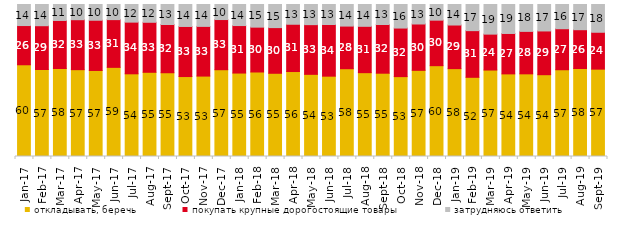
| Category | откладывать, беречь | покупать крупные дорогостоящие товары | затрудняюсь ответить |
|---|---|---|---|
| 2017-01-01 | 60.35 | 25.8 | 13.85 |
| 2017-02-01 | 56.8 | 28.6 | 13.85 |
| 2017-03-01 | 57.9 | 31.6 | 10.5 |
| 2017-04-01 | 57.1 | 32.85 | 10 |
| 2017-05-01 | 56.6 | 33.05 | 10.35 |
| 2017-06-01 | 58.65 | 31.4 | 9.95 |
| 2017-07-01 | 54.4 | 34 | 11.6 |
| 2017-08-01 | 55.4 | 32.9 | 11.7 |
| 2017-09-01 | 55.1 | 31.75 | 13.15 |
| 2017-10-01 | 52.6 | 32.95 | 14.45 |
| 2017-11-01 | 52.9 | 32.7 | 14.4 |
| 2017-12-01 | 57.1 | 33 | 9.9 |
| 2018-01-01 | 54.9 | 31.25 | 13.85 |
| 2018-02-01 | 55.6 | 29.5 | 14.9 |
| 2018-03-01 | 54.75 | 30.05 | 15.2 |
| 2018-04-01 | 55.9 | 31.1 | 13 |
| 2018-05-01 | 54.05 | 32.7 | 13.25 |
| 2018-06-01 | 52.85 | 34 | 13.15 |
| 2018-07-01 | 57.75 | 28.05 | 14.2 |
| 2018-08-01 | 55.15 | 30.5 | 14.35 |
| 2018-09-01 | 54.8 | 32.05 | 13.15 |
| 2018-10-01 | 52.55 | 31.95 | 15.5 |
| 2018-11-01 | 56.687 | 30.489 | 12.824 |
| 2018-12-01 | 59.75 | 29.95 | 10.3 |
| 2019-01-01 | 57.8 | 28.7 | 13.5 |
| 2019-02-01 | 52.1 | 30.7 | 17.2 |
| 2019-03-01 | 56.887 | 23.62 | 19.493 |
| 2019-04-01 | 54.356 | 26.584 | 19.059 |
| 2019-05-01 | 54.383 | 27.935 | 17.682 |
| 2019-06-01 | 53.815 | 28.778 | 17.406 |
| 2019-07-01 | 57.079 | 26.98 | 15.941 |
| 2019-08-01 | 57.892 | 25.524 | 16.583 |
| 2019-09-01 | 57.475 | 24.257 | 18.267 |